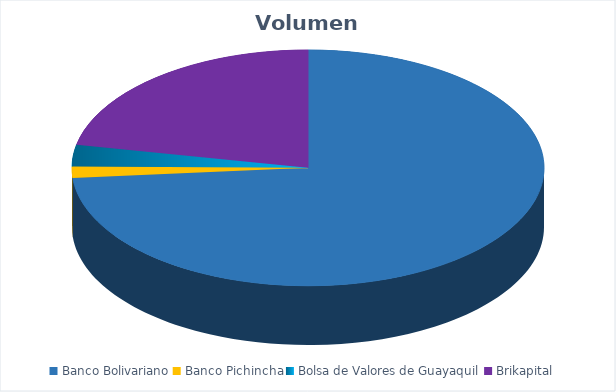
| Category | VOLUMEN ($USD) |
|---|---|
| Banco Bolivariano | 60635.6 |
| Banco Pichincha | 1274 |
| Bolsa de Valores de Guayaquil | 2438.8 |
| Brikapital | 18000 |